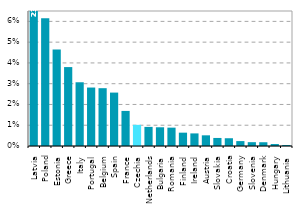
| Category | Series 0 |
|---|---|
| Latvia | 0.231 |
| Poland | 0.062 |
| Estonia | 0.046 |
| Greece | 0.038 |
| Italy | 0.031 |
| Portugal | 0.028 |
| Belgium | 0.028 |
| Spain | 0.026 |
| France | 0.017 |
| Czechia | 0.01 |
| Netherlands | 0.009 |
| Bulgaria | 0.009 |
| Romania | 0.009 |
| Finland | 0.006 |
| Ireland | 0.006 |
| Austria | 0.005 |
| Slovakia | 0.004 |
| Croatia | 0.004 |
| Germany | 0.002 |
| Slovenia | 0.002 |
| Denmark | 0.002 |
| Hungary | 0.001 |
| Lithuania | 0 |